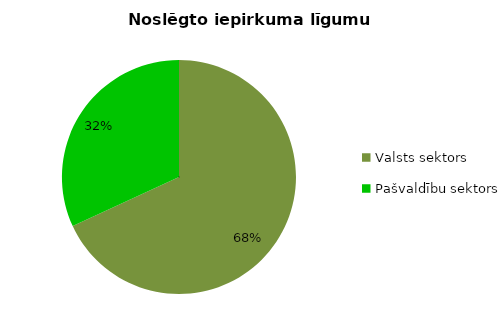
| Category | Noslēgto iepirkuma līgumu skaits |
|---|---|
| Valsts sektors | 6378 |
| Pašvaldību sektors | 2983 |